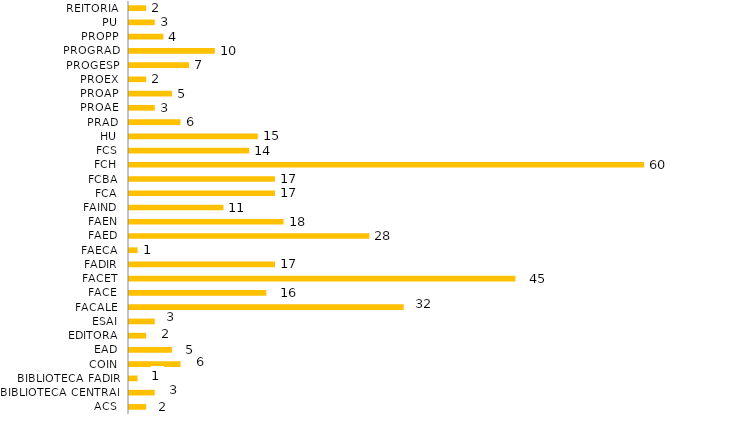
| Category | Lotação/Ano |
|---|---|
| ACS | 2 |
| BIBLIOTECA CENTRAL | 3 |
| BIBLIOTECA FADIR | 1 |
| COIN | 6 |
| EAD | 5 |
| EDITORA | 2 |
| ESAI | 3 |
| FACALE | 32 |
| FACE | 16 |
| FACET | 45 |
| FADIR | 17 |
| FAECA | 1 |
| FAED | 28 |
| FAEN | 18 |
| FAIND | 11 |
| FCA | 17 |
| FCBA | 17 |
| FCH | 60 |
| FCS | 14 |
| HU | 15 |
| PRAD | 6 |
| PROAE | 3 |
| PROAP | 5 |
| PROEX | 2 |
| PROGESP | 7 |
| PROGRAD | 10 |
| PROPP | 4 |
| PU | 3 |
| REITORIA | 2 |